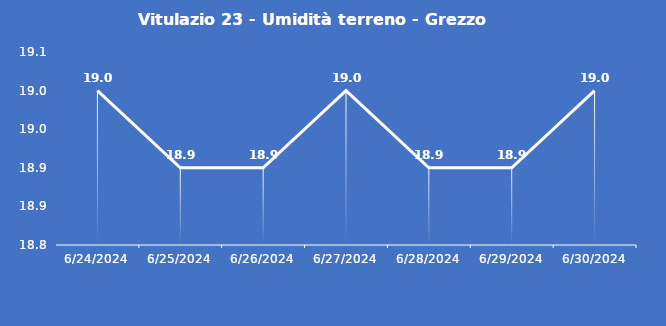
| Category | Vitulazio 23 - Umidità terreno - Grezzo (%VWC) |
|---|---|
| 6/24/24 | 19 |
| 6/25/24 | 18.9 |
| 6/26/24 | 18.9 |
| 6/27/24 | 19 |
| 6/28/24 | 18.9 |
| 6/29/24 | 18.9 |
| 6/30/24 | 19 |